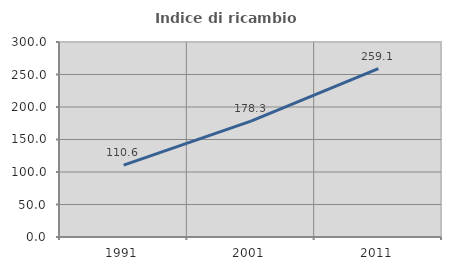
| Category | Indice di ricambio occupazionale  |
|---|---|
| 1991.0 | 110.638 |
| 2001.0 | 178.302 |
| 2011.0 | 259.064 |